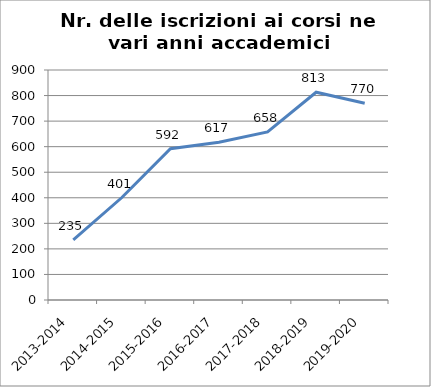
| Category | Nr. Iscrizioni ai Corsi |
|---|---|
| 2013-2014 | 235 |
| 2014-2015 | 401 |
| 2015-2016 | 592 |
| 2016-2017 | 617 |
| 2017-2018 | 658 |
| 2018-2019 | 813 |
| 2019-2020 | 770 |